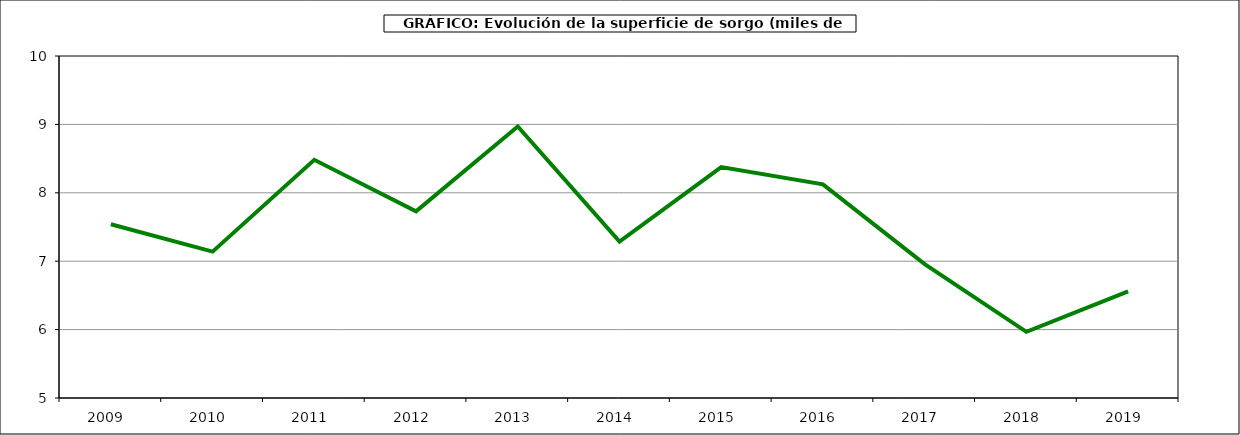
| Category | Superficie |
|---|---|
| 2009.0 | 7.541 |
| 2010.0 | 7.14 |
| 2011.0 | 8.482 |
| 2012.0 | 7.729 |
| 2013.0 | 8.97 |
| 2014.0 | 7.288 |
| 2015.0 | 8.375 |
| 2016.0 | 8.124 |
| 2017.0 | 6.958 |
| 2018.0 | 5.967 |
| 2019.0 | 6.56 |